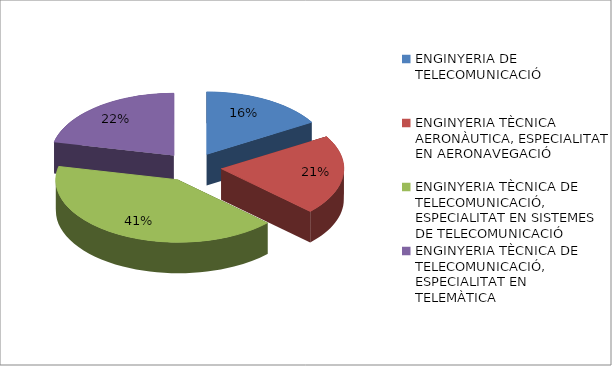
| Category | Series 0 |
|---|---|
| ENGINYERIA DE TELECOMUNICACIÓ | 0.164 |
| ENGINYERIA TÈCNICA AERONÀUTICA, ESPECIALITAT EN AERONAVEGACIÓ | 0.207 |
| ENGINYERIA TÈCNICA DE TELECOMUNICACIÓ, ESPECIALITAT EN SISTEMES DE TELECOMUNICACIÓ | 0.414 |
| ENGINYERIA TÈCNICA DE TELECOMUNICACIÓ, ESPECIALITAT EN TELEMÀTICA | 0.216 |